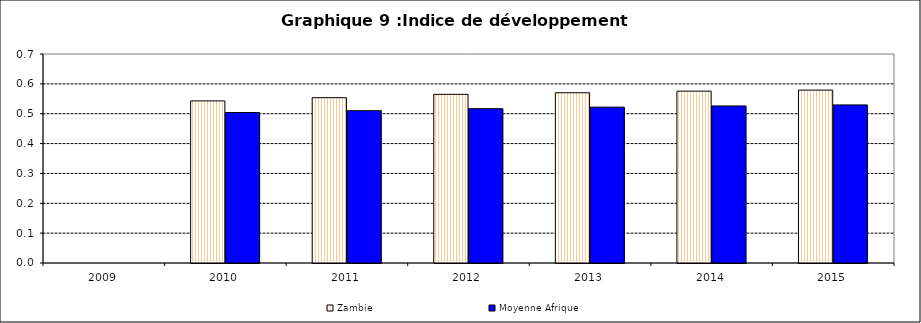
| Category | Zambie | Moyenne Afrique |
|---|---|---|
| 2009.0 | 0 | 0 |
| 2010.0 | 0.543 | 0.504 |
| 2011.0 | 0.554 | 0.51 |
| 2012.0 | 0.565 | 0.517 |
| 2013.0 | 0.57 | 0.522 |
| 2014.0 | 0.576 | 0.526 |
| 2015.0 | 0.579 | 0.53 |